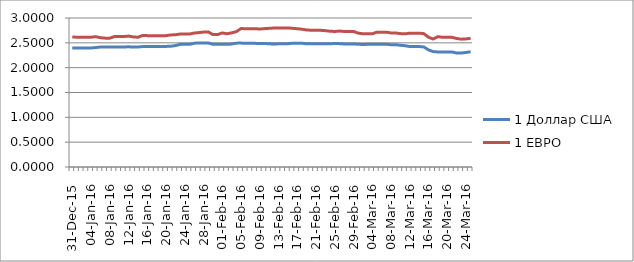
| Category | 1 Доллар США | 1 ЕВРО |
|---|---|---|
| 31-Dec-15 | 2.395 | 2.617 |
| 01-Jan-16 | 2.397 | 2.614 |
| 02-Jan-16 | 2.397 | 2.614 |
| 03-Jan-16 | 2.397 | 2.614 |
| 04-Jan-16 | 2.397 | 2.614 |
| 05-Jan-16 | 2.405 | 2.624 |
| 06-Jan-16 | 2.416 | 2.603 |
| 07-Jan-16 | 2.418 | 2.594 |
| 08-Jan-16 | 2.418 | 2.594 |
| 09-Jan-16 | 2.417 | 2.627 |
| 10-Jan-16 | 2.417 | 2.627 |
| 11-Jan-16 | 2.417 | 2.627 |
| 12-Jan-16 | 2.42 | 2.636 |
| 13-Jan-16 | 2.416 | 2.619 |
| 14-Jan-16 | 2.416 | 2.612 |
| 15-Jan-16 | 2.425 | 2.648 |
| 16-Jan-16 | 2.425 | 2.645 |
| 17-Jan-16 | 2.425 | 2.645 |
| 18-Jan-16 | 2.425 | 2.645 |
| 19-Jan-16 | 2.428 | 2.645 |
| 20-Jan-16 | 2.428 | 2.645 |
| 21-Jan-16 | 2.432 | 2.658 |
| 22-Jan-16 | 2.444 | 2.664 |
| 23-Jan-16 | 2.469 | 2.677 |
| 24-Jan-16 | 2.469 | 2.677 |
| 25-Jan-16 | 2.469 | 2.677 |
| 26-Jan-16 | 2.492 | 2.697 |
| 27-Jan-16 | 2.498 | 2.706 |
| 28-Jan-16 | 2.498 | 2.716 |
| 29-Jan-16 | 2.497 | 2.721 |
| 30-Jan-17 | 2.472 | 2.666 |
| 31-Jan-18 | 2.472 | 2.666 |
| 01-Feb-16 | 2.472 | 2.699 |
| 02-Feb-16 | 2.47 | 2.683 |
| 03-Feb-16 | 2.476 | 2.701 |
| 04-Feb-16 | 2.494 | 2.726 |
| 05-Feb-16 | 2.495 | 2.788 |
| 06-Feb-16 | 2.489 | 2.784 |
| 07-Feb-16 | 2.489 | 2.784 |
| 08-Feb-16 | 2.489 | 2.784 |
| 09-Feb-16 | 2.487 | 2.778 |
| 10-Feb-16 | 2.486 | 2.786 |
| 11-Feb-16 | 2.482 | 2.792 |
| 12-Feb-16 | 2.474 | 2.798 |
| 13-Feb-16 | 2.481 | 2.8 |
| 14-Feb-16 | 2.481 | 2.8 |
| 15-Feb-16 | 2.481 | 2.8 |
| 16-Feb-16 | 2.492 | 2.792 |
| 17-Feb-16 | 2.491 | 2.784 |
| 18-Feb-16 | 2.492 | 2.774 |
| 19-Feb-16 | 2.481 | 2.76 |
| 20-Feb-16 | 2.48 | 2.752 |
| 21-Feb-16 | 2.48 | 2.752 |
| 22-Feb-16 | 2.48 | 2.752 |
| 23-Feb-16 | 2.48 | 2.744 |
| 24-Feb-16 | 2.483 | 2.734 |
| 25-Feb-16 | 2.485 | 2.729 |
| 26-Feb-16 | 2.484 | 2.737 |
| 27-Feb-16 | 2.478 | 2.729 |
| 28-Feb-16 | 2.478 | 2.729 |
| 29-Feb-16 | 2.478 | 2.729 |
| 01-Mar-16 | 2.471 | 2.696 |
| 02-Mar-16 | 2.467 | 2.683 |
| 03-Mar-16 | 2.47 | 2.683 |
| 04-Mar-16 | 2.47 | 2.683 |
| 05-Mar-16 | 2.472 | 2.715 |
| 06-Mar-16 | 2.472 | 2.715 |
| 07-Mar-16 | 2.472 | 2.715 |
| 08-Mar-16 | 2.463 | 2.699 |
| 09-Mar-16 | 2.463 | 2.699 |
| 10-Mar-16 | 2.451 | 2.686 |
| 11-Mar-16 | 2.442 | 2.681 |
| 12-Mar-16 | 2.426 | 2.694 |
| 13-Mar-16 | 2.426 | 2.694 |
| 14-Mar-16 | 2.426 | 2.694 |
| 15-Mar-16 | 2.418 | 2.685 |
| 16-Mar-16 | 2.358 | 2.613 |
| 17-Mar-16 | 2.324 | 2.577 |
| 18-Mar-16 | 2.316 | 2.625 |
| 19-Mar-16 | 2.316 | 2.61 |
| 20-Mar-16 | 2.316 | 2.61 |
| 21-Mar-16 | 2.316 | 2.61 |
| 22-Mar-16 | 2.295 | 2.588 |
| 23-Mar-16 | 2.295 | 2.574 |
| 24-Mar-16 | 2.306 | 2.58 |
| 25-Mar-16 | 2.32 | 2.591 |